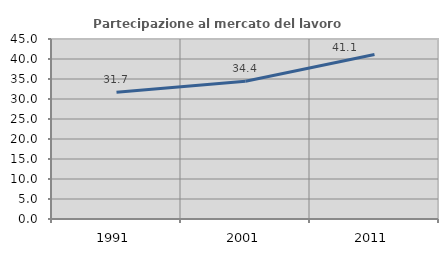
| Category | Partecipazione al mercato del lavoro  femminile |
|---|---|
| 1991.0 | 31.661 |
| 2001.0 | 34.436 |
| 2011.0 | 41.11 |